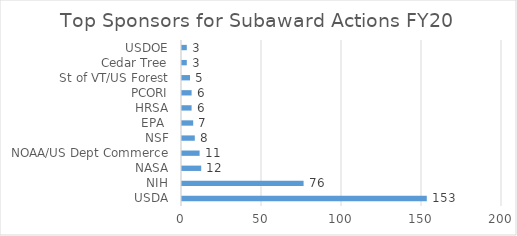
| Category | FY20 |
|---|---|
| USDA | 153 |
| NIH | 76 |
| NASA | 12 |
| NOAA/US Dept Commerce | 11 |
| NSF | 8 |
| EPA  | 7 |
| HRSA | 6 |
| PCORI | 6 |
| St of VT/US Forest | 5 |
| Cedar Tree | 3 |
| USDOE | 3 |